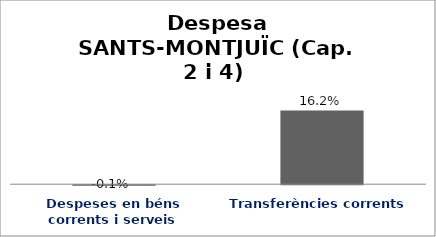
| Category | Series 0 |
|---|---|
| Despeses en béns corrents i serveis | -0.001 |
| Transferències corrents | 0.162 |